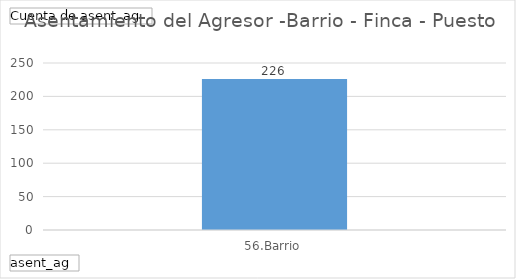
| Category | Total |
|---|---|
| 56.Barrio | 226 |